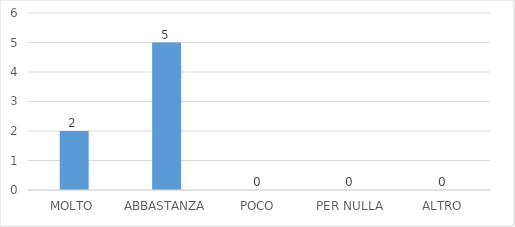
| Category | Series 0 |
|---|---|
| MOLTO | 2 |
| ABBASTANZA | 5 |
| POCO | 0 |
| PER NULLA | 0 |
| ALTRO | 0 |